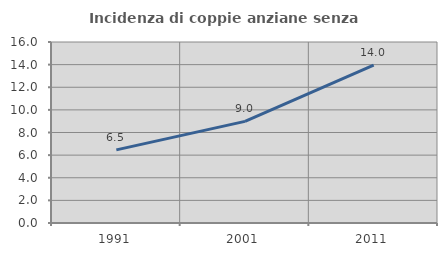
| Category | Incidenza di coppie anziane senza figli  |
|---|---|
| 1991.0 | 6.463 |
| 2001.0 | 8.982 |
| 2011.0 | 13.963 |